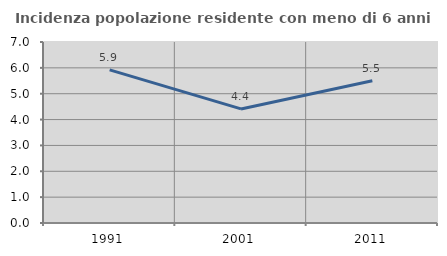
| Category | Incidenza popolazione residente con meno di 6 anni |
|---|---|
| 1991.0 | 5.921 |
| 2001.0 | 4.412 |
| 2011.0 | 5.499 |